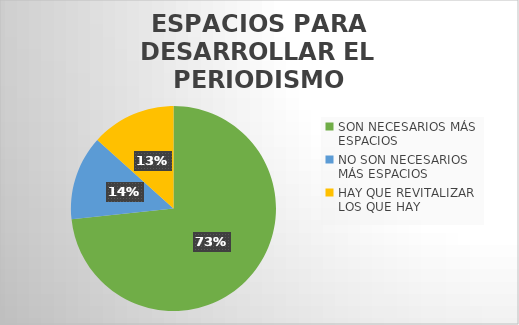
| Category | Series 0 |
|---|---|
| SON NECESARIOS MÁS ESPACIOS | 11 |
| NO SON NECESARIOS MÁS ESPACIOS | 2 |
| HAY QUE REVITALIZAR LOS QUE HAY | 2 |